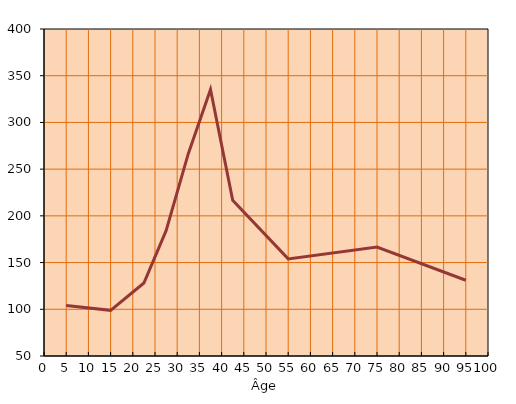
| Category | RM |
|---|---|
| 5.0 | 103.93 |
| 15.0 | 98.853 |
| 22.5 | 128.108 |
| 27.5 | 184.196 |
| 32.5 | 266.561 |
| 37.5 | 335.206 |
| 42.5 | 216.57 |
| 55.0 | 153.938 |
| 75.0 | 166.63 |
| 95.0 | 131.062 |